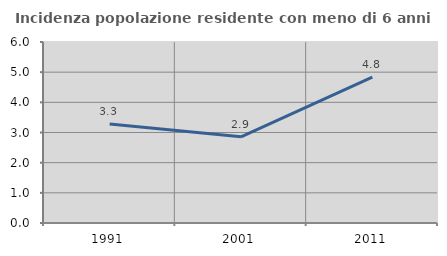
| Category | Incidenza popolazione residente con meno di 6 anni |
|---|---|
| 1991.0 | 3.283 |
| 2001.0 | 2.857 |
| 2011.0 | 4.839 |